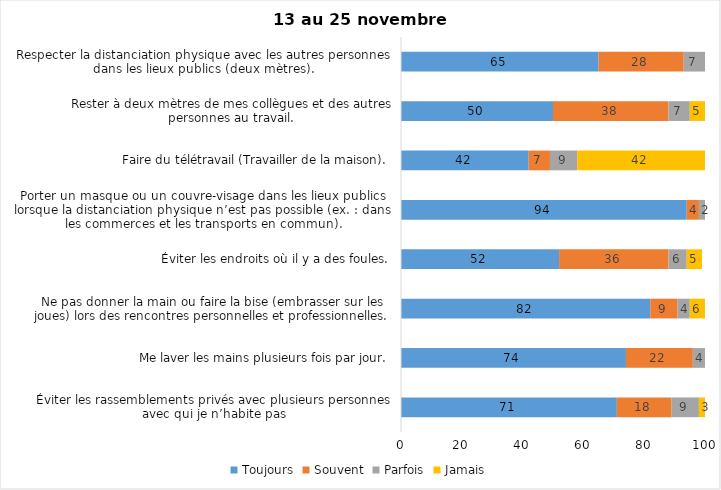
| Category | Toujours | Souvent | Parfois | Jamais |
|---|---|---|---|---|
| Éviter les rassemblements privés avec plusieurs personnes avec qui je n’habite pas | 71 | 18 | 9 | 3 |
| Me laver les mains plusieurs fois par jour. | 74 | 22 | 4 | 0 |
| Ne pas donner la main ou faire la bise (embrasser sur les joues) lors des rencontres personnelles et professionnelles. | 82 | 9 | 4 | 6 |
| Éviter les endroits où il y a des foules. | 52 | 36 | 6 | 5 |
| Porter un masque ou un couvre-visage dans les lieux publics lorsque la distanciation physique n’est pas possible (ex. : dans les commerces et les transports en commun). | 94 | 4 | 2 | 0 |
| Faire du télétravail (Travailler de la maison). | 42 | 7 | 9 | 42 |
| Rester à deux mètres de mes collègues et des autres personnes au travail. | 50 | 38 | 7 | 5 |
| Respecter la distanciation physique avec les autres personnes dans les lieux publics (deux mètres). | 65 | 28 | 7 | 0 |